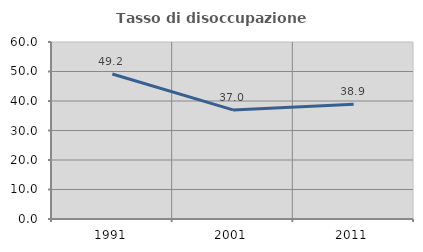
| Category | Tasso di disoccupazione giovanile  |
|---|---|
| 1991.0 | 49.16 |
| 2001.0 | 36.975 |
| 2011.0 | 38.865 |